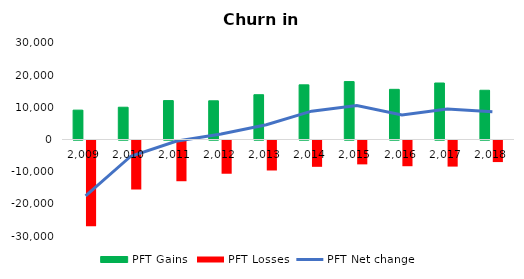
| Category | PFT Gains  | PFT Losses |
|---|---|---|
| 2009.0 | 9131 | -26620 |
| 2010.0 | 10034 | -15234 |
| 2011.0 | 12096 | -12663 |
| 2012.0 | 12033 | -10334 |
| 2013.0 | 13922 | -9323 |
| 2014.0 | 17000 | -8184 |
| 2015.0 | 18007 | -7422 |
| 2016.0 | 15595 | -7996 |
| 2017.0 | 17561 | -8113 |
| 2018.0 | 15308 | -6707 |